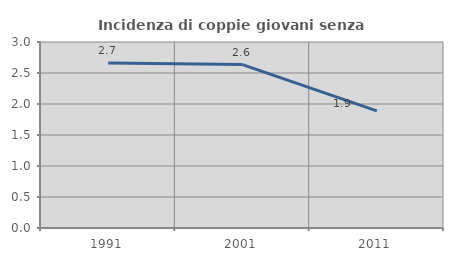
| Category | Incidenza di coppie giovani senza figli |
|---|---|
| 1991.0 | 2.66 |
| 2001.0 | 2.635 |
| 2011.0 | 1.89 |